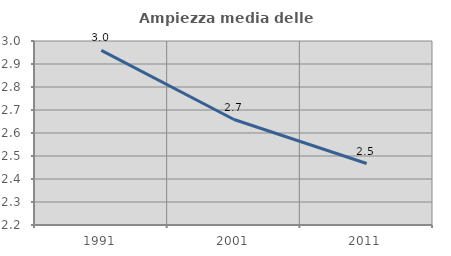
| Category | Ampiezza media delle famiglie |
|---|---|
| 1991.0 | 2.959 |
| 2001.0 | 2.659 |
| 2011.0 | 2.467 |